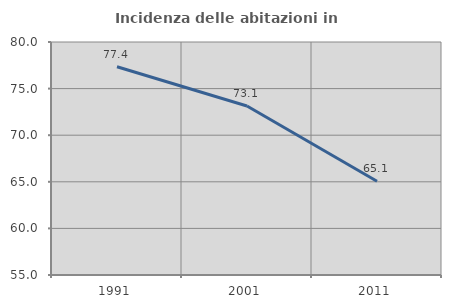
| Category | Incidenza delle abitazioni in proprietà  |
|---|---|
| 1991.0 | 77.351 |
| 2001.0 | 73.138 |
| 2011.0 | 65.052 |